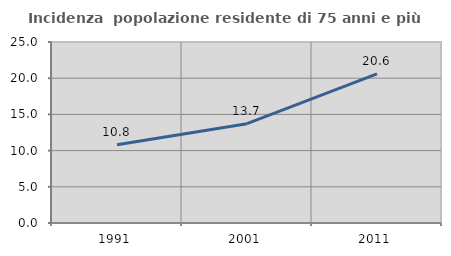
| Category | Incidenza  popolazione residente di 75 anni e più |
|---|---|
| 1991.0 | 10.822 |
| 2001.0 | 13.721 |
| 2011.0 | 20.588 |